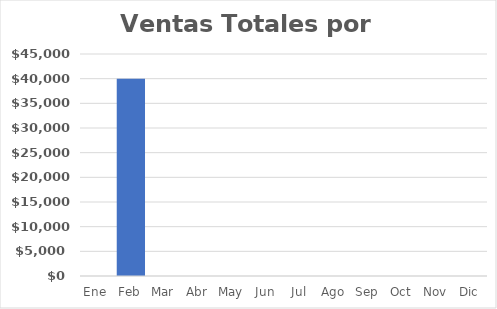
| Category | Series 0 |
|---|---|
| Ene | 0 |
| Feb | 40000 |
| Mar | 0 |
| Abr | 0 |
| May | 0 |
| Jun | 0 |
| Jul | 0 |
| Ago | 0 |
| Sep | 0 |
| Oct | 0 |
| Nov | 0 |
| Dic | 0 |